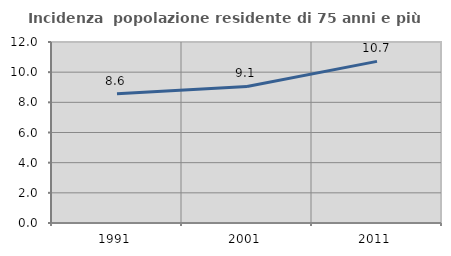
| Category | Incidenza  popolazione residente di 75 anni e più |
|---|---|
| 1991.0 | 8.573 |
| 2001.0 | 9.051 |
| 2011.0 | 10.716 |